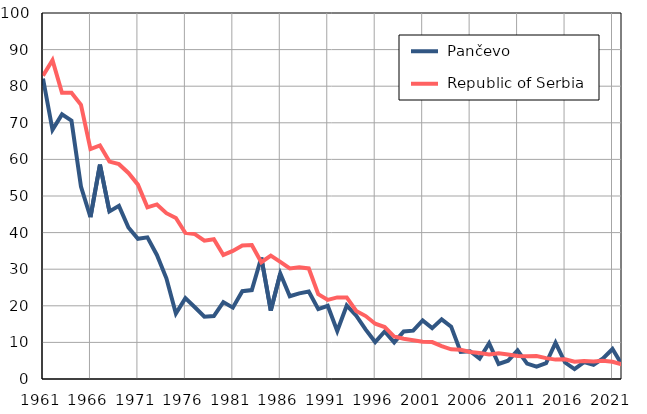
| Category |  Pančevo |  Republic of Serbia |
|---|---|---|
| 1961.0 | 82.1 | 82.9 |
| 1962.0 | 68.1 | 87.1 |
| 1963.0 | 72.3 | 78.2 |
| 1964.0 | 70.6 | 78.2 |
| 1965.0 | 52.6 | 74.9 |
| 1966.0 | 44.2 | 62.8 |
| 1967.0 | 58.6 | 63.8 |
| 1968.0 | 45.8 | 59.4 |
| 1969.0 | 47.3 | 58.7 |
| 1970.0 | 41.4 | 56.3 |
| 1971.0 | 38.3 | 53.1 |
| 1972.0 | 38.7 | 46.9 |
| 1973.0 | 33.9 | 47.7 |
| 1974.0 | 27.5 | 45.3 |
| 1975.0 | 17.9 | 44 |
| 1976.0 | 22.1 | 39.9 |
| 1977.0 | 19.6 | 39.6 |
| 1978.0 | 17 | 37.8 |
| 1979.0 | 17.2 | 38.2 |
| 1980.0 | 21 | 33.9 |
| 1981.0 | 19.5 | 35 |
| 1982.0 | 24 | 36.5 |
| 1983.0 | 24.3 | 36.6 |
| 1984.0 | 33.2 | 31.9 |
| 1985.0 | 18.7 | 33.7 |
| 1986.0 | 28.8 | 32 |
| 1987.0 | 22.6 | 30.2 |
| 1988.0 | 23.4 | 30.5 |
| 1989.0 | 23.9 | 30.2 |
| 1990.0 | 19.1 | 23.2 |
| 1991.0 | 20 | 21.6 |
| 1992.0 | 13.1 | 22.3 |
| 1993.0 | 20.1 | 22.3 |
| 1994.0 | 17.3 | 18.6 |
| 1995.0 | 13.5 | 17.2 |
| 1996.0 | 10.1 | 15.1 |
| 1997.0 | 13 | 14.2 |
| 1998.0 | 10 | 11.6 |
| 1999.0 | 13 | 11 |
| 2000.0 | 13.2 | 10.6 |
| 2001.0 | 16 | 10.2 |
| 2002.0 | 13.9 | 10.1 |
| 2003.0 | 16.3 | 9 |
| 2004.0 | 14.3 | 8.1 |
| 2005.0 | 7.4 | 8 |
| 2006.0 | 7.6 | 7.4 |
| 2007.0 | 5.6 | 7.1 |
| 2008.0 | 9.8 | 6.7 |
| 2009.0 | 4.1 | 7 |
| 2010.0 | 5 | 6.7 |
| 2011.0 | 7.8 | 6.3 |
| 2012.0 | 4.2 | 6.2 |
| 2013.0 | 3.4 | 6.3 |
| 2014.0 | 4.3 | 5.7 |
| 2015.0 | 9.9 | 5.3 |
| 2016.0 | 4.5 | 5.4 |
| 2017.0 | 2.7 | 4.7 |
| 2018.0 | 4.6 | 4.9 |
| 2019.0 | 3.9 | 4.8 |
| 2020.0 | 5.6 | 5 |
| 2021.0 | 8.2 | 4.7 |
| 2022.0 | 3.9 | 4 |